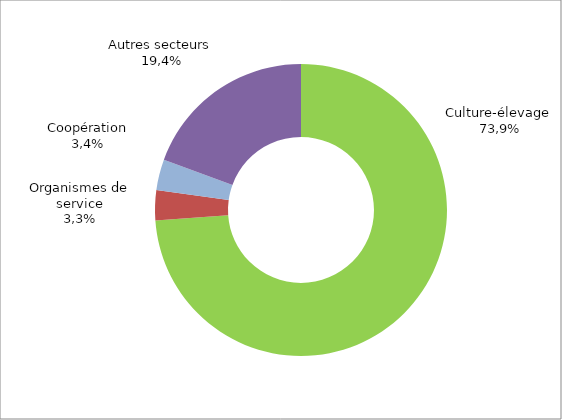
| Category | Series 0 |
|---|---|
| Exploitation Culture-élevage | 141096 |
| Organismes de service | 6341 |
| Coopération | 6501 |
| Autres activités | 37095 |